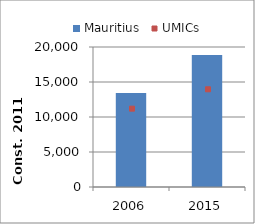
| Category | Mauritius |
|---|---|
| 2006.0 | 13441.206 |
| 2015.0 | 18864.106 |